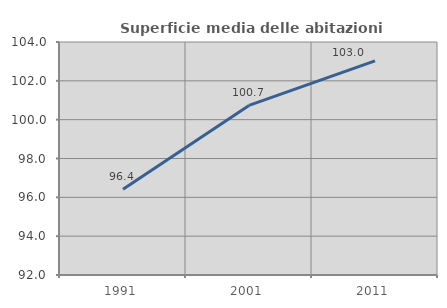
| Category | Superficie media delle abitazioni occupate |
|---|---|
| 1991.0 | 96.418 |
| 2001.0 | 100.733 |
| 2011.0 | 103.024 |